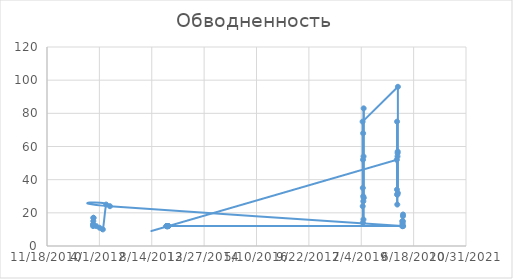
| Category | Обводненность |
|---|---|
| 40940.0 | 12 |
| 40941.0 | 13 |
| 40942.0 | 15 |
| 40943.0 | 17 |
| 40944.0 | 17 |
| 40940.0 | 13 |
| 40970.0 | 12 |
| 41002.0 | 11 |
| 41033.0 | 10 |
| 41065.0 | 25 |
| 41101.0 | 24 |
| 43891.0 | 12 |
| 43892.0 | 15 |
| 43893.0 | 12 |
| 43894.0 | 13 |
| 43895.0 | 14 |
| 43896.0 | 12 |
| 43897.0 | 15 |
| 43898.0 | 18 |
| 43899.0 | 19 |
| 43900.0 | 12 |
| 41640.0 | 12 |
| 41641.0 | 12 |
| 41642.0 | 12 |
| 41643.0 | 12 |
| 41644.0 | 12 |
| 41645.0 | 12 |
| 41646.0 | 12 |
| 41647.0 | 12 |
| 41648.0 | 12 |
| 41649.0 | 12 |
| 41650.0 | 12 |
| 41651.0 | 12 |
| 41652.0 | 12 |
| 41653.0 | 12 |
| 41654.0 | 12 |
| 41655.0 | 12 |
| 41656.0 | 12 |
| 41657.0 | 12 |
| 41658.0 | 12 |
| 43840.0 | 52 |
| 43841.0 | 34 |
| 43842.0 | 75 |
| 43843.0 | 31 |
| 43844.0 | 25 |
| 43845.0 | 31 |
| 43846.0 | 54 |
| 43847.0 | 56 |
| 43848.0 | 57 |
| 43849.0 | 32 |
| 43850.0 | 96 |
| 43513.0 | 75 |
| 43514.0 | 24 |
| 43515.0 | 35 |
| 43516.0 | 14 |
| 43517.0 | 52 |
| 43518.0 | 68 |
| 43519.0 | 30 |
| 43520.0 | 27 |
| 43521.0 | 16 |
| 43522.0 | 54 |
| 43523.0 | 83 |
| 43524.0 | 29 |